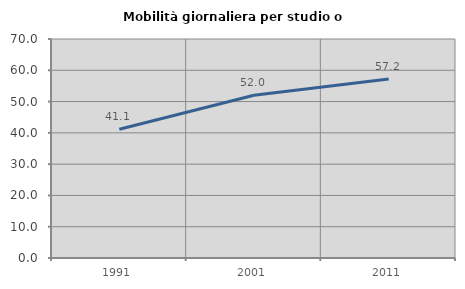
| Category | Mobilità giornaliera per studio o lavoro |
|---|---|
| 1991.0 | 41.139 |
| 2001.0 | 52 |
| 2011.0 | 57.193 |